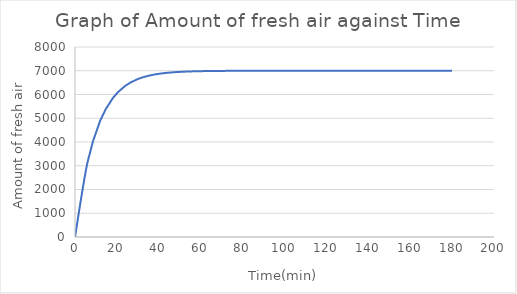
| Category | Series 0 |
|---|---|
| 0.0 | 0 |
| 6.0 | 3158.319 |
| 12.0 | 4891.641 |
| 18.0 | 5842.908 |
| 24.0 | 6364.974 |
| 30.0 | 6651.491 |
| 36.0 | 6808.734 |
| 42.0 | 6895.031 |
| 48.0 | 6942.392 |
| 54.0 | 6968.384 |
| 60.0 | 6982.649 |
| 66.0 | 6990.477 |
| 72.0 | 6994.774 |
| 78.0 | 6997.132 |
| 84.0 | 6998.426 |
| 90.0 | 6999.136 |
| 96.0 | 6999.526 |
| 102.0 | 6999.74 |
| 108.0 | 6999.857 |
| 114.0 | 6999.922 |
| 120.0 | 6999.957 |
| 126.0 | 6999.976 |
| 132.0 | 6999.987 |
| 138.0 | 6999.993 |
| 144.0 | 6999.996 |
| 150.0 | 6999.998 |
| 156.0 | 6999.999 |
| 162.0 | 6999.999 |
| 168.0 | 7000 |
| 174.0 | 7000 |
| 180.0 | 7000 |